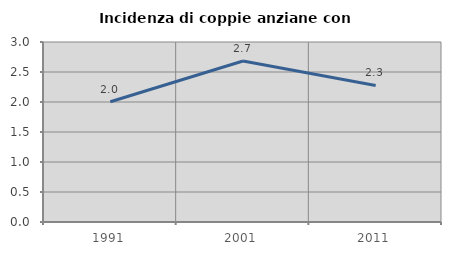
| Category | Incidenza di coppie anziane con figli |
|---|---|
| 1991.0 | 2.003 |
| 2001.0 | 2.684 |
| 2011.0 | 2.276 |